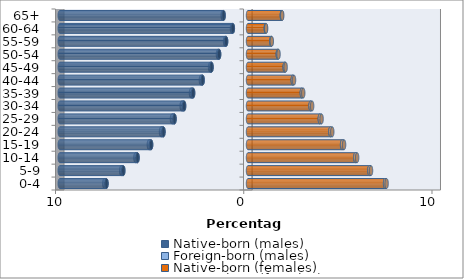
| Category | Native-born (males) | Foreign-born (males) | Native-born (females) | Foreign-born (females) |
|---|---|---|---|---|
| 0-4 | -7.517 | -0.116 | 7.281 | 0.082 |
| 5-9 | -6.624 | -0.113 | 6.445 | 0.09 |
| 10-14 | -5.867 | -0.113 | 5.698 | 0.1 |
| 15-19 | -5.146 | -0.121 | 4.997 | 0.107 |
| 20-24 | -4.49 | -0.13 | 4.374 | 0.103 |
| 25-29 | -3.902 | -0.137 | 3.815 | 0.094 |
| 30-34 | -3.394 | -0.129 | 3.323 | 0.084 |
| 35-39 | -2.915 | -0.113 | 2.858 | 0.076 |
| 40-44 | -2.41 | -0.092 | 2.378 | 0.067 |
| 45-49 | -1.936 | -0.077 | 1.948 | 0.052 |
| 50-54 | -1.534 | -0.064 | 1.583 | 0.04 |
| 55-59 | -1.163 | -0.054 | 1.237 | 0.026 |
| 60-64 | -0.805 | -0.047 | 0.946 | 0.017 |
| 65+ | -1.296 | -0.051 | 1.796 | 0.022 |